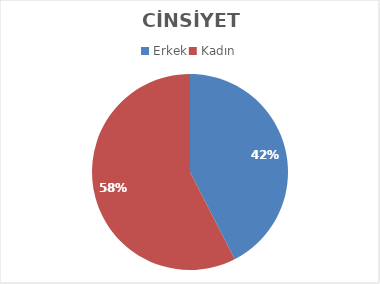
| Category | Series 0 |
|---|---|
| Erkek | 152 |
| Kadın | 206 |